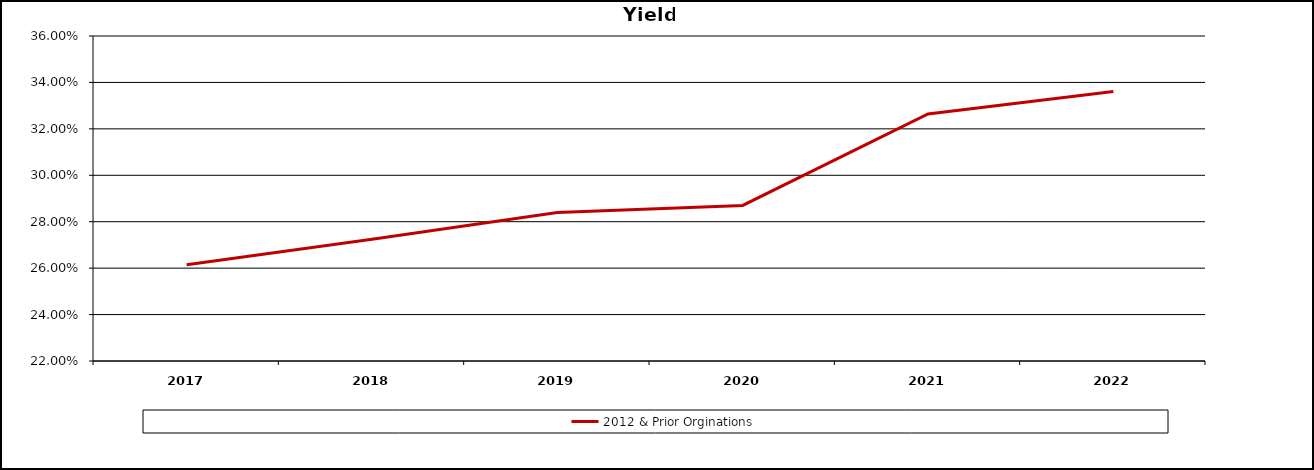
| Category | 2012 & Prior Orginations  |
|---|---|
| 2017.0 | 0.262 |
| 2018.0 | 0.272 |
| 2019.0 | 0.284 |
| 2020.0 | 0.287 |
| 2021.0 | 0.326 |
| 2022.0 | 0.336 |